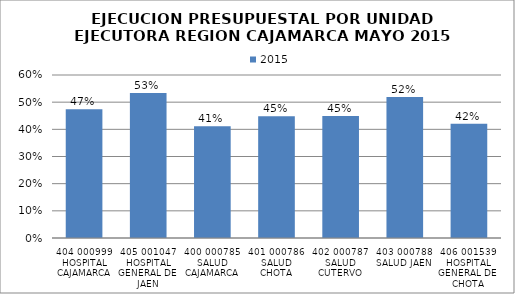
| Category | 2015 |
|---|---|
| 404 000999 HOSPITAL CAJAMARCA | 0.474 |
| 405 001047 HOSPITAL GENERAL DE JAEN | 0.534 |
| 400 000785 SALUD CAJAMARCA | 0.412 |
| 401 000786 SALUD CHOTA | 0.449 |
| 402 000787 SALUD CUTERVO | 0.449 |
| 403 000788 SALUD JAEN | 0.519 |
| 406 001539 HOSPITAL GENERAL DE CHOTA | 0.42 |